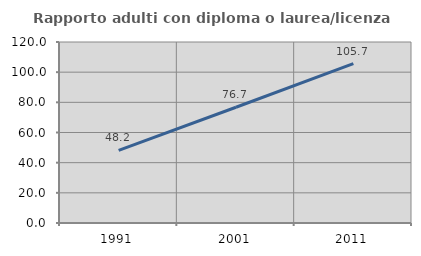
| Category | Rapporto adulti con diploma o laurea/licenza media  |
|---|---|
| 1991.0 | 48.193 |
| 2001.0 | 76.744 |
| 2011.0 | 105.682 |